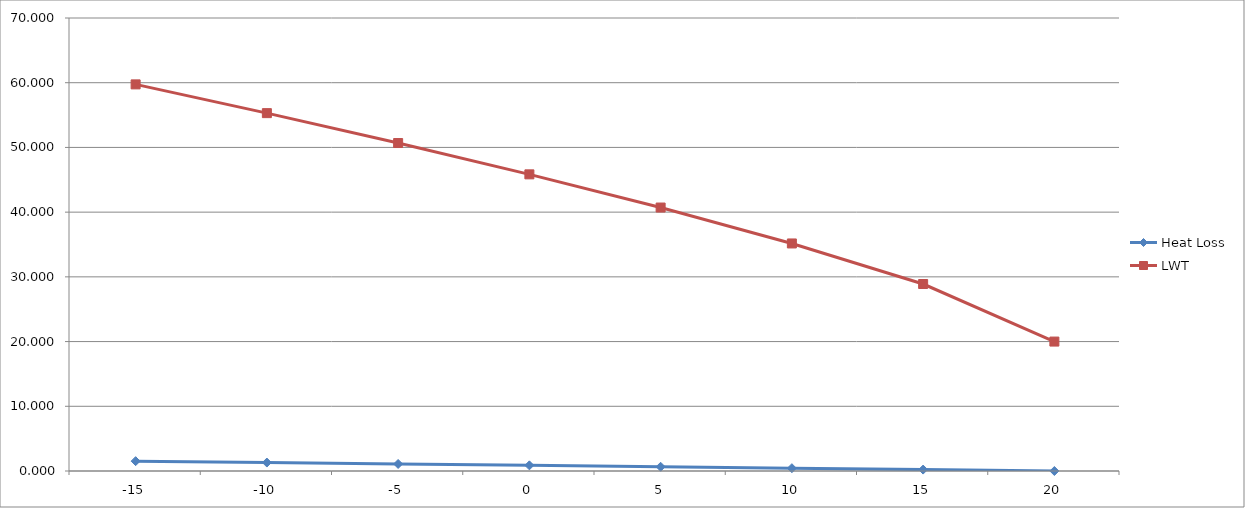
| Category | Heat Loss | LWT |
|---|---|---|
| -15.0 | 1.522 | 59.743 |
| -10.0 | 1.304 | 55.299 |
| -5.0 | 1.087 | 50.68 |
| 0.0 | 0.87 | 45.841 |
| 5.0 | 0.652 | 40.711 |
| 10.0 | 0.435 | 35.162 |
| 15.0 | 0.217 | 28.896 |
| 20.0 | 0 | 20 |